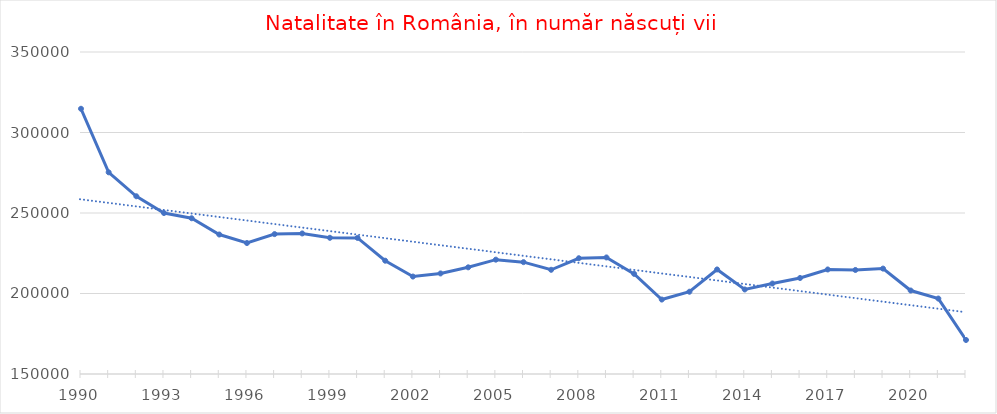
| Category | Număr născuți vii |
|---|---|
| 1990.0 | 314746 |
| 1991.0 | 275275 |
| 1992.0 | 260393 |
| 1993.0 | 249994 |
| 1994.0 | 246736 |
| 1995.0 | 236640 |
| 1996.0 | 231348 |
| 1997.0 | 236891 |
| 1998.0 | 237297 |
| 1999.0 | 234600 |
| 2000.0 | 234521 |
| 2001.0 | 220368 |
| 2002.0 | 210529 |
| 2003.0 | 212459 |
| 2004.0 | 216261 |
| 2005.0 | 221020 |
| 2006.0 | 219483 |
| 2007.0 | 214728 |
| 2008.0 | 221900 |
| 2009.0 | 222388 |
| 2010.0 | 212199 |
| 2011.0 | 196242 |
| 2012.0 | 201104 |
| 2013.0 | 214932 |
| 2014.0 | 202501 |
| 2015.0 | 206190 |
| 2016.0 | 209641 |
| 2017.0 | 214928 |
| 2018.0 | 214614 |
| 2019.0 | 215467 |
| 2020.0 | 201849 |
| 2021.0 | 196858 |
| 2022.0 | 171132 |